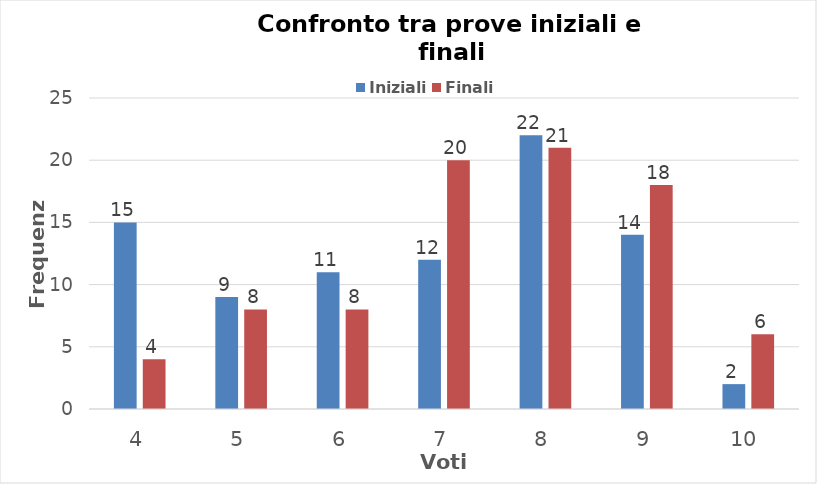
| Category | Iniziali | Finali |
|---|---|---|
| 4.0 | 15 | 4 |
| 5.0 | 9 | 8 |
| 6.0 | 11 | 8 |
| 7.0 | 12 | 20 |
| 8.0 | 22 | 21 |
| 9.0 | 14 | 18 |
| 10.0 | 2 | 6 |